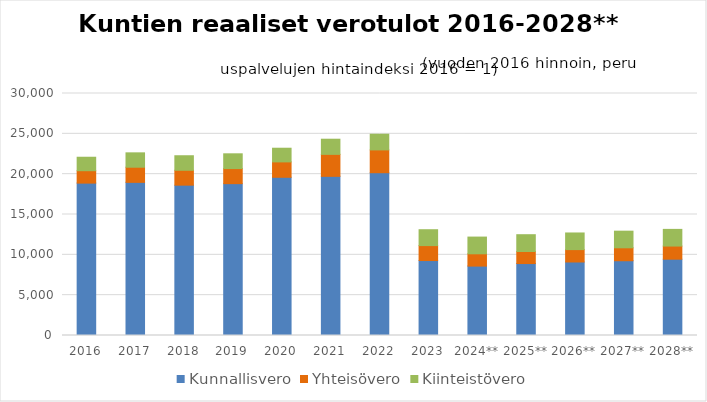
| Category | Kunnallisvero | Yhteisövero | Kiinteistövero |
|---|---|---|---|
| 2016 | 18890.563 | 1537.872 | 1669.703 |
| 2017 | 18984.903 | 1876.821 | 1781.79 |
| 2018 | 18637.434 | 1845.137 | 1801.77 |
| 2019 | 18825.284 | 1868.046 | 1830.346 |
| 2020 | 19613.622 | 1907.626 | 1694.608 |
| 2021 | 19729.802 | 2724.595 | 1879.564 |
| 2022 | 20180.604 | 2827.179 | 1944.423 |
| 2023 | 9292.666 | 1854.007 | 1966.804 |
| 2024** | 8603.554 | 1524.008 | 2073.359 |
| 2025** | 8920.355 | 1492.511 | 2082.573 |
| 2026** | 9112.951 | 1535.795 | 2061.869 |
| 2027** | 9267.51 | 1604.152 | 2061.294 |
| 2028** | 9461.775 | 1625.987 | 2067.21 |